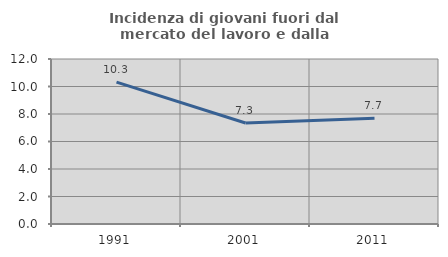
| Category | Incidenza di giovani fuori dal mercato del lavoro e dalla formazione  |
|---|---|
| 1991.0 | 10.32 |
| 2001.0 | 7.347 |
| 2011.0 | 7.692 |